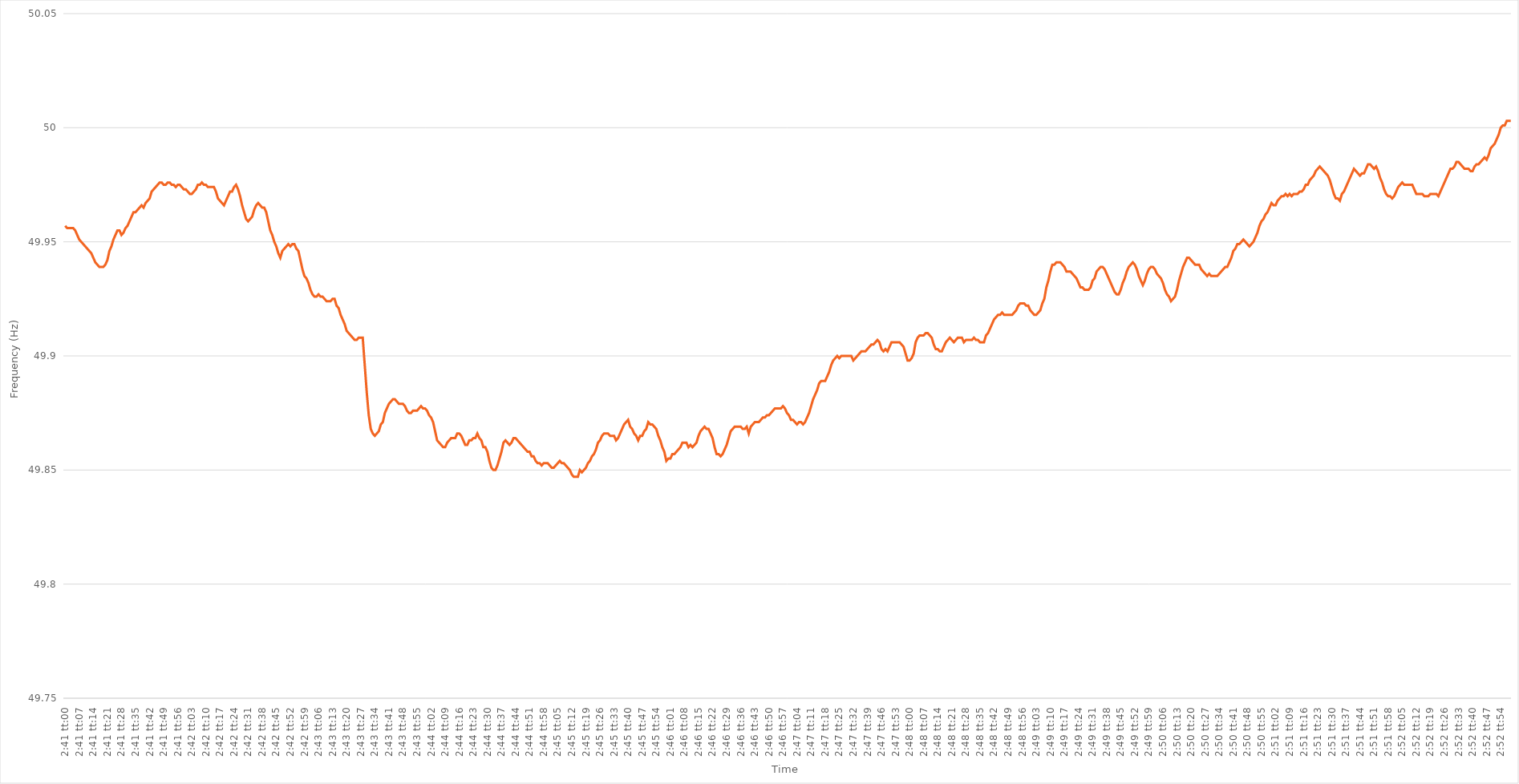
| Category | Series 0 |
|---|---|
| 0.11180555555555556 | 49.957 |
| 0.11181712962962963 | 49.956 |
| 0.1118287037037037 | 49.956 |
| 0.11184027777777777 | 49.956 |
| 0.11185185185185186 | 49.956 |
| 0.11186342592592592 | 49.955 |
| 0.111875 | 49.953 |
| 0.11188657407407408 | 49.951 |
| 0.11189814814814815 | 49.95 |
| 0.11190972222222222 | 49.949 |
| 0.11192129629629628 | 49.948 |
| 0.11193287037037036 | 49.947 |
| 0.11194444444444444 | 49.946 |
| 0.11195601851851851 | 49.945 |
| 0.11196759259259259 | 49.943 |
| 0.11197916666666667 | 49.941 |
| 0.11199074074074074 | 49.94 |
| 0.11200231481481482 | 49.939 |
| 0.1120138888888889 | 49.939 |
| 0.11202546296296297 | 49.939 |
| 0.11203703703703705 | 49.94 |
| 0.11204861111111113 | 49.942 |
| 0.11206018518518518 | 49.946 |
| 0.11207175925925926 | 49.948 |
| 0.11208333333333333 | 49.951 |
| 0.11209490740740741 | 49.953 |
| 0.11210648148148149 | 49.955 |
| 0.11211805555555555 | 49.955 |
| 0.11212962962962963 | 49.953 |
| 0.11214120370370372 | 49.954 |
| 0.11215277777777777 | 49.956 |
| 0.11216435185185185 | 49.957 |
| 0.11217592592592592 | 49.959 |
| 0.1121875 | 49.961 |
| 0.11219907407407408 | 49.963 |
| 0.11221064814814814 | 49.963 |
| 0.11222222222222222 | 49.964 |
| 0.1122337962962963 | 49.965 |
| 0.11224537037037037 | 49.966 |
| 0.11225694444444445 | 49.965 |
| 0.11226851851851853 | 49.967 |
| 0.11228009259259258 | 49.968 |
| 0.11229166666666668 | 49.969 |
| 0.11230324074074073 | 49.972 |
| 0.11231481481481481 | 49.973 |
| 0.11232638888888889 | 49.974 |
| 0.11233796296296296 | 49.975 |
| 0.11234953703703704 | 49.976 |
| 0.11236111111111112 | 49.976 |
| 0.11237268518518519 | 49.975 |
| 0.11238425925925927 | 49.975 |
| 0.11239583333333332 | 49.976 |
| 0.1124074074074074 | 49.976 |
| 0.11241898148148148 | 49.975 |
| 0.11243055555555555 | 49.975 |
| 0.11244212962962963 | 49.974 |
| 0.11245370370370371 | 49.975 |
| 0.11246527777777778 | 49.975 |
| 0.11247685185185186 | 49.974 |
| 0.11248842592592594 | 49.973 |
| 0.1125 | 49.973 |
| 0.11251157407407408 | 49.972 |
| 0.11252314814814814 | 49.971 |
| 0.11253472222222222 | 49.971 |
| 0.1125462962962963 | 49.972 |
| 0.11255787037037036 | 49.973 |
| 0.11256944444444444 | 49.975 |
| 0.11258101851851852 | 49.975 |
| 0.11259259259259259 | 49.976 |
| 0.11260416666666667 | 49.975 |
| 0.11261574074074072 | 49.975 |
| 0.1126273148148148 | 49.974 |
| 0.11263888888888889 | 49.974 |
| 0.11265046296296295 | 49.974 |
| 0.11266203703703703 | 49.974 |
| 0.11267361111111111 | 49.972 |
| 0.11268518518518518 | 49.969 |
| 0.11269675925925926 | 49.968 |
| 0.11270833333333334 | 49.967 |
| 0.11271990740740741 | 49.966 |
| 0.11273148148148149 | 49.968 |
| 0.11274305555555557 | 49.97 |
| 0.11275462962962964 | 49.972 |
| 0.1127662037037037 | 49.972 |
| 0.11277777777777777 | 49.974 |
| 0.11278935185185185 | 49.975 |
| 0.11280092592592593 | 49.973 |
| 0.1128125 | 49.97 |
| 0.11282407407407408 | 49.966 |
| 0.11283564814814816 | 49.963 |
| 0.11284722222222222 | 49.96 |
| 0.11285879629629629 | 49.959 |
| 0.11287037037037036 | 49.96 |
| 0.11288194444444444 | 49.961 |
| 0.11289351851851852 | 49.964 |
| 0.11290509259259258 | 49.966 |
| 0.11291666666666667 | 49.967 |
| 0.11292824074074075 | 49.966 |
| 0.11293981481481481 | 49.965 |
| 0.11295138888888889 | 49.965 |
| 0.11296296296296297 | 49.963 |
| 0.11297453703703704 | 49.959 |
| 0.11298611111111112 | 49.955 |
| 0.1129976851851852 | 49.953 |
| 0.11300925925925925 | 49.95 |
| 0.11302083333333333 | 49.948 |
| 0.1130324074074074 | 49.945 |
| 0.11304398148148148 | 49.943 |
| 0.11305555555555556 | 49.946 |
| 0.11306712962962963 | 49.947 |
| 0.11307870370370371 | 49.948 |
| 0.11309027777777779 | 49.949 |
| 0.11310185185185184 | 49.948 |
| 0.11311342592592592 | 49.949 |
| 0.11312499999999999 | 49.949 |
| 0.11313657407407407 | 49.947 |
| 0.11314814814814815 | 49.946 |
| 0.11315972222222222 | 49.942 |
| 0.1131712962962963 | 49.938 |
| 0.11318287037037038 | 49.935 |
| 0.11319444444444444 | 49.934 |
| 0.11320601851851853 | 49.932 |
| 0.1132175925925926 | 49.929 |
| 0.11322916666666666 | 49.927 |
| 0.11324074074074075 | 49.926 |
| 0.1132523148148148 | 49.926 |
| 0.11326388888888889 | 49.927 |
| 0.11327546296296297 | 49.926 |
| 0.11328703703703703 | 49.926 |
| 0.11329861111111111 | 49.925 |
| 0.1133101851851852 | 49.924 |
| 0.11332175925925925 | 49.924 |
| 0.11333333333333334 | 49.924 |
| 0.1133449074074074 | 49.925 |
| 0.11335648148148147 | 49.925 |
| 0.11336805555555556 | 49.922 |
| 0.11337962962962962 | 49.921 |
| 0.1133912037037037 | 49.918 |
| 0.11340277777777778 | 49.916 |
| 0.11341435185185185 | 49.914 |
| 0.11342592592592593 | 49.911 |
| 0.11343750000000001 | 49.91 |
| 0.11344907407407408 | 49.909 |
| 0.11346064814814816 | 49.908 |
| 0.11347222222222221 | 49.907 |
| 0.11348379629629629 | 49.907 |
| 0.11349537037037037 | 49.908 |
| 0.11350694444444444 | 49.908 |
| 0.11351851851851852 | 49.908 |
| 0.1135300925925926 | 49.896 |
| 0.11354166666666667 | 49.884 |
| 0.11355324074074075 | 49.874 |
| 0.1135648148148148 | 49.868 |
| 0.11357638888888888 | 49.866 |
| 0.11358796296296296 | 49.865 |
| 0.11359953703703703 | 49.866 |
| 0.11361111111111111 | 49.867 |
| 0.11362268518518519 | 49.87 |
| 0.11363425925925925 | 49.871 |
| 0.11364583333333333 | 49.875 |
| 0.11365740740740742 | 49.877 |
| 0.11366898148148148 | 49.879 |
| 0.11368055555555556 | 49.88 |
| 0.11369212962962964 | 49.881 |
| 0.11370370370370371 | 49.881 |
| 0.11371527777777778 | 49.88 |
| 0.11372685185185184 | 49.879 |
| 0.11373842592592592 | 49.879 |
| 0.11375 | 49.879 |
| 0.11376157407407407 | 49.878 |
| 0.11377314814814815 | 49.876 |
| 0.11378472222222223 | 49.875 |
| 0.1137962962962963 | 49.875 |
| 0.11380787037037036 | 49.876 |
| 0.11381944444444443 | 49.876 |
| 0.11383101851851851 | 49.876 |
| 0.11384259259259259 | 49.877 |
| 0.11385416666666666 | 49.878 |
| 0.11386574074074074 | 49.877 |
| 0.11387731481481482 | 49.877 |
| 0.11388888888888889 | 49.876 |
| 0.11390046296296297 | 49.874 |
| 0.11391203703703705 | 49.873 |
| 0.11392361111111111 | 49.871 |
| 0.1139351851851852 | 49.867 |
| 0.11394675925925928 | 49.863 |
| 0.11395833333333333 | 49.862 |
| 0.11396990740740741 | 49.861 |
| 0.11398148148148148 | 49.86 |
| 0.11399305555555556 | 49.86 |
| 0.11400462962962964 | 49.862 |
| 0.1140162037037037 | 49.863 |
| 0.11402777777777778 | 49.864 |
| 0.11403935185185186 | 49.864 |
| 0.11405092592592592 | 49.864 |
| 0.1140625 | 49.866 |
| 0.11407407407407406 | 49.866 |
| 0.11408564814814814 | 49.865 |
| 0.11409722222222222 | 49.863 |
| 0.11410879629629629 | 49.861 |
| 0.11412037037037037 | 49.861 |
| 0.11413194444444445 | 49.863 |
| 0.11414351851851852 | 49.863 |
| 0.1141550925925926 | 49.864 |
| 0.11416666666666668 | 49.864 |
| 0.11417824074074073 | 49.866 |
| 0.11418981481481481 | 49.864 |
| 0.11420138888888888 | 49.863 |
| 0.11421296296296296 | 49.86 |
| 0.11422453703703704 | 49.86 |
| 0.11423611111111111 | 49.858 |
| 0.11424768518518519 | 49.854 |
| 0.11425925925925927 | 49.851 |
| 0.11427083333333332 | 49.85 |
| 0.11428240740740742 | 49.85 |
| 0.11429398148148147 | 49.852 |
| 0.11430555555555555 | 49.855 |
| 0.11431712962962963 | 49.858 |
| 0.1143287037037037 | 49.862 |
| 0.11434027777777778 | 49.863 |
| 0.11435185185185186 | 49.862 |
| 0.11436342592592592 | 49.861 |
| 0.114375 | 49.862 |
| 0.11438657407407408 | 49.864 |
| 0.11439814814814815 | 49.864 |
| 0.11440972222222223 | 49.863 |
| 0.11442129629629628 | 49.862 |
| 0.11443287037037037 | 49.861 |
| 0.11444444444444445 | 49.86 |
| 0.11445601851851851 | 49.859 |
| 0.11446759259259259 | 49.858 |
| 0.11447916666666667 | 49.858 |
| 0.11449074074074074 | 49.856 |
| 0.11450231481481482 | 49.856 |
| 0.11451388888888887 | 49.854 |
| 0.11452546296296295 | 49.853 |
| 0.11453703703703703 | 49.853 |
| 0.1145486111111111 | 49.852 |
| 0.11456018518518518 | 49.853 |
| 0.11457175925925926 | 49.853 |
| 0.11458333333333333 | 49.853 |
| 0.11459490740740741 | 49.852 |
| 0.11460648148148149 | 49.851 |
| 0.11461805555555556 | 49.851 |
| 0.11462962962962964 | 49.852 |
| 0.11464120370370372 | 49.853 |
| 0.11465277777777778 | 49.854 |
| 0.11466435185185185 | 49.853 |
| 0.11467592592592592 | 49.853 |
| 0.1146875 | 49.852 |
| 0.11469907407407408 | 49.851 |
| 0.11471064814814814 | 49.85 |
| 0.11472222222222223 | 49.848 |
| 0.1147337962962963 | 49.847 |
| 0.11474537037037037 | 49.847 |
| 0.11475694444444444 | 49.847 |
| 0.1147685185185185 | 49.85 |
| 0.11478009259259259 | 49.849 |
| 0.11479166666666667 | 49.85 |
| 0.11480324074074073 | 49.851 |
| 0.11481481481481481 | 49.853 |
| 0.1148263888888889 | 49.854 |
| 0.11483796296296296 | 49.856 |
| 0.11484953703703704 | 49.857 |
| 0.11486111111111112 | 49.859 |
| 0.11487268518518519 | 49.862 |
| 0.11488425925925926 | 49.863 |
| 0.11489583333333335 | 49.865 |
| 0.1149074074074074 | 49.866 |
| 0.11491898148148148 | 49.866 |
| 0.11493055555555555 | 49.866 |
| 0.11494212962962963 | 49.865 |
| 0.11495370370370371 | 49.865 |
| 0.11496527777777778 | 49.865 |
| 0.11497685185185186 | 49.863 |
| 0.11498842592592594 | 49.864 |
| 0.11499999999999999 | 49.866 |
| 0.11501157407407407 | 49.868 |
| 0.11502314814814814 | 49.87 |
| 0.11503472222222222 | 49.871 |
| 0.1150462962962963 | 49.872 |
| 0.11505787037037037 | 49.869 |
| 0.11506944444444445 | 49.868 |
| 0.11508101851851853 | 49.866 |
| 0.1150925925925926 | 49.865 |
| 0.11510416666666667 | 49.863 |
| 0.11511574074074075 | 49.865 |
| 0.11512731481481481 | 49.865 |
| 0.11513888888888889 | 49.867 |
| 0.11515046296296295 | 49.868 |
| 0.11516203703703703 | 49.871 |
| 0.11517361111111112 | 49.87 |
| 0.11518518518518518 | 49.87 |
| 0.11519675925925926 | 49.869 |
| 0.11520833333333334 | 49.868 |
| 0.1152199074074074 | 49.865 |
| 0.11523148148148148 | 49.863 |
| 0.11524305555555554 | 49.86 |
| 0.11525462962962962 | 49.858 |
| 0.1152662037037037 | 49.854 |
| 0.11527777777777777 | 49.855 |
| 0.11528935185185185 | 49.855 |
| 0.11530092592592593 | 49.857 |
| 0.1153125 | 49.857 |
| 0.11532407407407408 | 49.858 |
| 0.11533564814814816 | 49.859 |
| 0.11534722222222223 | 49.86 |
| 0.1153587962962963 | 49.862 |
| 0.11537037037037036 | 49.862 |
| 0.11538194444444444 | 49.862 |
| 0.11539351851851852 | 49.86 |
| 0.11540509259259259 | 49.861 |
| 0.11541666666666667 | 49.86 |
| 0.11542824074074075 | 49.861 |
| 0.11543981481481481 | 49.862 |
| 0.1154513888888889 | 49.865 |
| 0.11546296296296295 | 49.867 |
| 0.11547453703703703 | 49.868 |
| 0.11548611111111111 | 49.869 |
| 0.11549768518518518 | 49.868 |
| 0.11550925925925926 | 49.868 |
| 0.11552083333333334 | 49.866 |
| 0.1155324074074074 | 49.864 |
| 0.11554398148148148 | 49.86 |
| 0.11555555555555556 | 49.857 |
| 0.11556712962962963 | 49.857 |
| 0.11557870370370371 | 49.856 |
| 0.11559027777777779 | 49.857 |
| 0.11560185185185186 | 49.859 |
| 0.11561342592592593 | 49.861 |
| 0.11562499999999999 | 49.864 |
| 0.11563657407407407 | 49.867 |
| 0.11564814814814815 | 49.868 |
| 0.11565972222222222 | 49.869 |
| 0.1156712962962963 | 49.869 |
| 0.11568287037037038 | 49.869 |
| 0.11569444444444445 | 49.869 |
| 0.11570601851851851 | 49.868 |
| 0.11571759259259258 | 49.868 |
| 0.11572916666666666 | 49.869 |
| 0.11574074074074074 | 49.866 |
| 0.11575231481481481 | 49.869 |
| 0.11576388888888889 | 49.87 |
| 0.11577546296296297 | 49.871 |
| 0.11578703703703704 | 49.871 |
| 0.11579861111111112 | 49.871 |
| 0.1158101851851852 | 49.872 |
| 0.11582175925925926 | 49.873 |
| 0.11583333333333333 | 49.873 |
| 0.11584490740740742 | 49.874 |
| 0.11585648148148148 | 49.874 |
| 0.11586805555555556 | 49.875 |
| 0.11587962962962962 | 49.876 |
| 0.1158912037037037 | 49.877 |
| 0.11590277777777779 | 49.877 |
| 0.11591435185185185 | 49.877 |
| 0.11592592592592592 | 49.877 |
| 0.11593750000000001 | 49.878 |
| 0.11594907407407407 | 49.877 |
| 0.11596064814814815 | 49.875 |
| 0.11597222222222221 | 49.874 |
| 0.1159837962962963 | 49.872 |
| 0.11599537037037037 | 49.872 |
| 0.11600694444444444 | 49.871 |
| 0.11601851851851852 | 49.87 |
| 0.1160300925925926 | 49.871 |
| 0.11604166666666667 | 49.871 |
| 0.11605324074074075 | 49.87 |
| 0.11606481481481483 | 49.871 |
| 0.11607638888888888 | 49.873 |
| 0.11608796296296296 | 49.875 |
| 0.11609953703703703 | 49.878 |
| 0.11611111111111111 | 49.881 |
| 0.11612268518518519 | 49.883 |
| 0.11613425925925926 | 49.885 |
| 0.11614583333333334 | 49.888 |
| 0.11615740740740742 | 49.889 |
| 0.11616898148148147 | 49.889 |
| 0.11618055555555555 | 49.889 |
| 0.11619212962962962 | 49.891 |
| 0.1162037037037037 | 49.893 |
| 0.11621527777777778 | 49.896 |
| 0.11622685185185185 | 49.898 |
| 0.11623842592592593 | 49.899 |
| 0.11625 | 49.9 |
| 0.11626157407407407 | 49.899 |
| 0.11627314814814815 | 49.9 |
| 0.11628472222222223 | 49.9 |
| 0.1162962962962963 | 49.9 |
| 0.11630787037037038 | 49.9 |
| 0.11631944444444443 | 49.9 |
| 0.11633101851851851 | 49.9 |
| 0.1163425925925926 | 49.898 |
| 0.11635416666666666 | 49.899 |
| 0.11636574074074074 | 49.9 |
| 0.11637731481481482 | 49.901 |
| 0.11638888888888889 | 49.902 |
| 0.11640046296296297 | 49.902 |
| 0.11641203703703702 | 49.902 |
| 0.1164236111111111 | 49.903 |
| 0.11643518518518518 | 49.904 |
| 0.11644675925925925 | 49.905 |
| 0.11645833333333333 | 49.905 |
| 0.11646990740740741 | 49.906 |
| 0.11648148148148148 | 49.907 |
| 0.11649305555555556 | 49.906 |
| 0.11650462962962964 | 49.903 |
| 0.1165162037037037 | 49.902 |
| 0.11652777777777779 | 49.903 |
| 0.11653935185185187 | 49.902 |
| 0.11655092592592593 | 49.904 |
| 0.1165625 | 49.906 |
| 0.11657407407407407 | 49.906 |
| 0.11658564814814815 | 49.906 |
| 0.11659722222222223 | 49.906 |
| 0.1166087962962963 | 49.906 |
| 0.11662037037037037 | 49.905 |
| 0.11663194444444445 | 49.904 |
| 0.11664351851851852 | 49.901 |
| 0.11665509259259259 | 49.898 |
| 0.11666666666666665 | 49.898 |
| 0.11667824074074074 | 49.899 |
| 0.11668981481481482 | 49.901 |
| 0.11670138888888888 | 49.906 |
| 0.11671296296296296 | 49.908 |
| 0.11672453703703704 | 49.909 |
| 0.11673611111111111 | 49.909 |
| 0.11674768518518519 | 49.909 |
| 0.11675925925925927 | 49.91 |
| 0.11677083333333334 | 49.91 |
| 0.1167824074074074 | 49.909 |
| 0.11679398148148147 | 49.908 |
| 0.11680555555555555 | 49.905 |
| 0.11681712962962963 | 49.903 |
| 0.1168287037037037 | 49.903 |
| 0.11684027777777778 | 49.902 |
| 0.11685185185185186 | 49.902 |
| 0.11686342592592593 | 49.904 |
| 0.11687499999999999 | 49.906 |
| 0.11688657407407409 | 49.907 |
| 0.11689814814814814 | 49.908 |
| 0.11690972222222222 | 49.907 |
| 0.11692129629629629 | 49.906 |
| 0.11693287037037037 | 49.907 |
| 0.11694444444444445 | 49.908 |
| 0.11695601851851851 | 49.908 |
| 0.1169675925925926 | 49.908 |
| 0.11697916666666668 | 49.906 |
| 0.11699074074074074 | 49.907 |
| 0.11700231481481482 | 49.907 |
| 0.1170138888888889 | 49.907 |
| 0.11702546296296296 | 49.907 |
| 0.11703703703703704 | 49.908 |
| 0.1170486111111111 | 49.907 |
| 0.11706018518518518 | 49.907 |
| 0.11707175925925926 | 49.906 |
| 0.11708333333333333 | 49.906 |
| 0.11709490740740741 | 49.906 |
| 0.11710648148148149 | 49.909 |
| 0.11711805555555554 | 49.91 |
| 0.11712962962962963 | 49.912 |
| 0.11714120370370369 | 49.914 |
| 0.11715277777777777 | 49.916 |
| 0.11716435185185185 | 49.917 |
| 0.11717592592592592 | 49.918 |
| 0.1171875 | 49.918 |
| 0.11719907407407408 | 49.919 |
| 0.11721064814814815 | 49.918 |
| 0.11722222222222223 | 49.918 |
| 0.11723379629629631 | 49.918 |
| 0.11724537037037037 | 49.918 |
| 0.11725694444444446 | 49.918 |
| 0.11726851851851851 | 49.919 |
| 0.11728009259259259 | 49.92 |
| 0.11729166666666667 | 49.922 |
| 0.11730324074074074 | 49.923 |
| 0.11731481481481482 | 49.923 |
| 0.1173263888888889 | 49.923 |
| 0.11733796296296296 | 49.922 |
| 0.11734953703703704 | 49.922 |
| 0.1173611111111111 | 49.92 |
| 0.11737268518518518 | 49.919 |
| 0.11738425925925926 | 49.918 |
| 0.11739583333333332 | 49.918 |
| 0.1174074074074074 | 49.919 |
| 0.11741898148148149 | 49.92 |
| 0.11743055555555555 | 49.923 |
| 0.11744212962962963 | 49.925 |
| 0.11745370370370371 | 49.93 |
| 0.11746527777777778 | 49.933 |
| 0.11747685185185186 | 49.937 |
| 0.11748842592592591 | 49.94 |
| 0.11750000000000001 | 49.94 |
| 0.11751157407407407 | 49.941 |
| 0.11752314814814814 | 49.941 |
| 0.11753472222222222 | 49.941 |
| 0.1175462962962963 | 49.94 |
| 0.11755787037037037 | 49.939 |
| 0.11756944444444445 | 49.937 |
| 0.11758101851851853 | 49.937 |
| 0.1175925925925926 | 49.937 |
| 0.11760416666666666 | 49.936 |
| 0.11761574074074073 | 49.935 |
| 0.11762731481481481 | 49.934 |
| 0.11763888888888889 | 49.932 |
| 0.11765046296296296 | 49.93 |
| 0.11766203703703704 | 49.93 |
| 0.11767361111111112 | 49.929 |
| 0.11768518518518518 | 49.929 |
| 0.11769675925925926 | 49.929 |
| 0.11770833333333335 | 49.93 |
| 0.11771990740740741 | 49.933 |
| 0.11773148148148148 | 49.934 |
| 0.11774305555555555 | 49.937 |
| 0.11775462962962963 | 49.938 |
| 0.1177662037037037 | 49.939 |
| 0.11777777777777777 | 49.939 |
| 0.11778935185185185 | 49.938 |
| 0.11780092592592593 | 49.936 |
| 0.1178125 | 49.934 |
| 0.11782407407407407 | 49.932 |
| 0.11783564814814813 | 49.93 |
| 0.11784722222222221 | 49.928 |
| 0.1178587962962963 | 49.927 |
| 0.11787037037037036 | 49.927 |
| 0.11788194444444444 | 49.929 |
| 0.11789351851851852 | 49.932 |
| 0.11790509259259259 | 49.934 |
| 0.11791666666666667 | 49.937 |
| 0.11792824074074075 | 49.939 |
| 0.11793981481481482 | 49.94 |
| 0.1179513888888889 | 49.941 |
| 0.11796296296296298 | 49.94 |
| 0.11797453703703703 | 49.938 |
| 0.11798611111111111 | 49.935 |
| 0.11799768518518518 | 49.933 |
| 0.11800925925925926 | 49.931 |
| 0.11802083333333334 | 49.933 |
| 0.1180324074074074 | 49.936 |
| 0.11804398148148149 | 49.938 |
| 0.11805555555555557 | 49.939 |
| 0.11806712962962962 | 49.939 |
| 0.1180787037037037 | 49.938 |
| 0.11809027777777777 | 49.936 |
| 0.11810185185185185 | 49.935 |
| 0.11811342592592593 | 49.934 |
| 0.118125 | 49.932 |
| 0.11813657407407407 | 49.929 |
| 0.11814814814814815 | 49.927 |
| 0.11815972222222222 | 49.926 |
| 0.1181712962962963 | 49.924 |
| 0.11818287037037038 | 49.925 |
| 0.11819444444444445 | 49.926 |
| 0.11820601851851853 | 49.929 |
| 0.11821759259259258 | 49.933 |
| 0.11822916666666666 | 49.936 |
| 0.11824074074074074 | 49.939 |
| 0.11825231481481481 | 49.941 |
| 0.11826388888888889 | 49.943 |
| 0.11827546296296297 | 49.943 |
| 0.11828703703703704 | 49.942 |
| 0.11829861111111112 | 49.941 |
| 0.11831018518518517 | 49.94 |
| 0.11832175925925925 | 49.94 |
| 0.11833333333333333 | 49.94 |
| 0.1183449074074074 | 49.938 |
| 0.11835648148148148 | 49.937 |
| 0.11836805555555556 | 49.936 |
| 0.11837962962962963 | 49.935 |
| 0.1183912037037037 | 49.936 |
| 0.11840277777777779 | 49.935 |
| 0.11841435185185185 | 49.935 |
| 0.11842592592592593 | 49.935 |
| 0.11843749999999999 | 49.935 |
| 0.11844907407407408 | 49.936 |
| 0.11846064814814815 | 49.937 |
| 0.11847222222222221 | 49.938 |
| 0.1184837962962963 | 49.939 |
| 0.11849537037037038 | 49.939 |
| 0.11850694444444444 | 49.941 |
| 0.11851851851851852 | 49.943 |
| 0.11853009259259258 | 49.946 |
| 0.11854166666666667 | 49.947 |
| 0.11855324074074074 | 49.949 |
| 0.1185648148148148 | 49.949 |
| 0.11857638888888888 | 49.95 |
| 0.11858796296296296 | 49.951 |
| 0.11859953703703703 | 49.95 |
| 0.11861111111111111 | 49.949 |
| 0.11862268518518519 | 49.948 |
| 0.11863425925925926 | 49.949 |
| 0.11864583333333334 | 49.95 |
| 0.11865740740740742 | 49.952 |
| 0.11866898148148149 | 49.954 |
| 0.11868055555555555 | 49.957 |
| 0.11869212962962962 | 49.959 |
| 0.1187037037037037 | 49.96 |
| 0.11871527777777778 | 49.962 |
| 0.11872685185185185 | 49.963 |
| 0.11873842592592593 | 49.965 |
| 0.11875000000000001 | 49.967 |
| 0.11876157407407407 | 49.966 |
| 0.11877314814814814 | 49.966 |
| 0.11878472222222221 | 49.968 |
| 0.11879629629629629 | 49.969 |
| 0.11880787037037037 | 49.97 |
| 0.11881944444444444 | 49.97 |
| 0.11883101851851852 | 49.971 |
| 0.1188425925925926 | 49.97 |
| 0.11885416666666666 | 49.971 |
| 0.11886574074074074 | 49.97 |
| 0.11887731481481482 | 49.971 |
| 0.11888888888888889 | 49.971 |
| 0.11890046296296297 | 49.971 |
| 0.11891203703703705 | 49.972 |
| 0.1189236111111111 | 49.972 |
| 0.11893518518518519 | 49.973 |
| 0.11894675925925925 | 49.975 |
| 0.11895833333333333 | 49.975 |
| 0.11896990740740741 | 49.977 |
| 0.11898148148148148 | 49.978 |
| 0.11899305555555556 | 49.979 |
| 0.11900462962962964 | 49.981 |
| 0.1190162037037037 | 49.982 |
| 0.11902777777777777 | 49.983 |
| 0.11903935185185184 | 49.982 |
| 0.11905092592592592 | 49.981 |
| 0.1190625 | 49.98 |
| 0.11907407407407407 | 49.979 |
| 0.11908564814814815 | 49.977 |
| 0.11909722222222223 | 49.974 |
| 0.1191087962962963 | 49.971 |
| 0.11912037037037038 | 49.969 |
| 0.11913194444444446 | 49.969 |
| 0.11914351851851852 | 49.968 |
| 0.1191550925925926 | 49.971 |
| 0.11916666666666666 | 49.972 |
| 0.11917824074074074 | 49.974 |
| 0.11918981481481482 | 49.976 |
| 0.11920138888888888 | 49.978 |
| 0.11921296296296297 | 49.98 |
| 0.11922453703703705 | 49.982 |
| 0.11923611111111111 | 49.981 |
| 0.11924768518518519 | 49.98 |
| 0.11925925925925925 | 49.979 |
| 0.11927083333333333 | 49.98 |
| 0.1192824074074074 | 49.98 |
| 0.11929398148148147 | 49.982 |
| 0.11930555555555555 | 49.984 |
| 0.11931712962962963 | 49.984 |
| 0.1193287037037037 | 49.983 |
| 0.11934027777777778 | 49.982 |
| 0.11935185185185186 | 49.983 |
| 0.11936342592592593 | 49.981 |
| 0.11937500000000001 | 49.978 |
| 0.11938657407407406 | 49.976 |
| 0.11939814814814814 | 49.973 |
| 0.11940972222222222 | 49.971 |
| 0.11942129629629629 | 49.97 |
| 0.11943287037037037 | 49.97 |
| 0.11944444444444445 | 49.969 |
| 0.11945601851851852 | 49.97 |
| 0.1194675925925926 | 49.972 |
| 0.11947916666666665 | 49.974 |
| 0.11949074074074074 | 49.975 |
| 0.11950231481481481 | 49.976 |
| 0.11951388888888888 | 49.975 |
| 0.11952546296296296 | 49.975 |
| 0.11953703703703704 | 49.975 |
| 0.1195486111111111 | 49.975 |
| 0.11956018518518519 | 49.975 |
| 0.11957175925925927 | 49.973 |
| 0.11958333333333333 | 49.971 |
| 0.11959490740740741 | 49.971 |
| 0.1196064814814815 | 49.971 |
| 0.11961805555555556 | 49.971 |
| 0.11962962962962963 | 49.97 |
| 0.1196412037037037 | 49.97 |
| 0.11965277777777777 | 49.97 |
| 0.11966435185185186 | 49.971 |
| 0.11967592592592592 | 49.971 |
| 0.1196875 | 49.971 |
| 0.11969907407407408 | 49.971 |
| 0.11971064814814815 | 49.97 |
| 0.11972222222222222 | 49.972 |
| 0.11973379629629628 | 49.974 |
| 0.11974537037037036 | 49.976 |
| 0.11975694444444444 | 49.978 |
| 0.11976851851851851 | 49.98 |
| 0.11978009259259259 | 49.982 |
| 0.11979166666666667 | 49.982 |
| 0.11980324074074074 | 49.983 |
| 0.11981481481481482 | 49.985 |
| 0.1198263888888889 | 49.985 |
| 0.11983796296296297 | 49.984 |
| 0.11984953703703705 | 49.983 |
| 0.11986111111111113 | 49.982 |
| 0.11987268518518518 | 49.982 |
| 0.11988425925925926 | 49.982 |
| 0.11989583333333333 | 49.981 |
| 0.11990740740740741 | 49.981 |
| 0.11991898148148149 | 49.983 |
| 0.11993055555555555 | 49.984 |
| 0.11994212962962963 | 49.984 |
| 0.11995370370370372 | 49.985 |
| 0.11996527777777777 | 49.986 |
| 0.11997685185185185 | 49.987 |
| 0.11998842592592592 | 49.986 |
| 0.12 | 49.988 |
| 0.12001157407407408 | 49.991 |
| 0.12002314814814814 | 49.992 |
| 0.12003472222222222 | 49.993 |
| 0.1200462962962963 | 49.995 |
| 0.12005787037037037 | 49.997 |
| 0.12006944444444445 | 50 |
| 0.12008101851851853 | 50.001 |
| 0.12009259259259258 | 50.001 |
| 0.12010416666666668 | 50.003 |
| 0.12011574074074073 | 50.003 |
| 0.12012731481481481 | 50.003 |